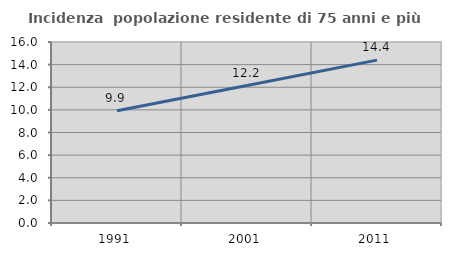
| Category | Incidenza  popolazione residente di 75 anni e più |
|---|---|
| 1991.0 | 9.916 |
| 2001.0 | 12.151 |
| 2011.0 | 14.396 |